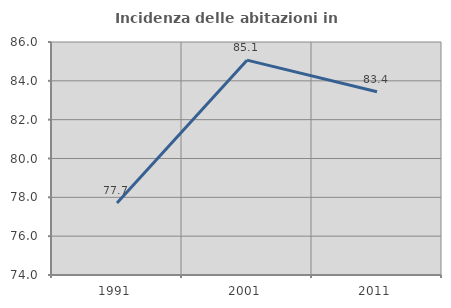
| Category | Incidenza delle abitazioni in proprietà  |
|---|---|
| 1991.0 | 77.707 |
| 2001.0 | 85.065 |
| 2011.0 | 83.436 |